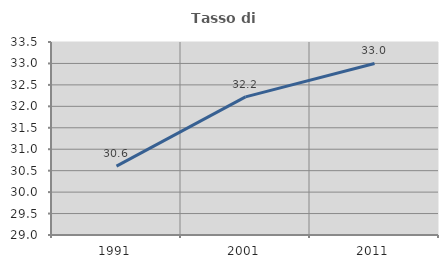
| Category | Tasso di occupazione   |
|---|---|
| 1991.0 | 30.605 |
| 2001.0 | 32.22 |
| 2011.0 | 32.999 |